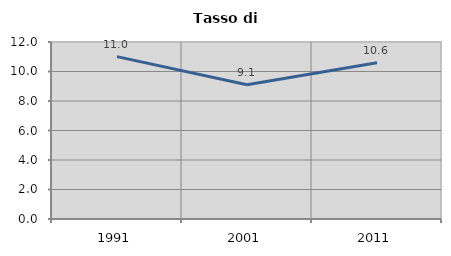
| Category | Tasso di disoccupazione   |
|---|---|
| 1991.0 | 11.009 |
| 2001.0 | 9.107 |
| 2011.0 | 10.594 |